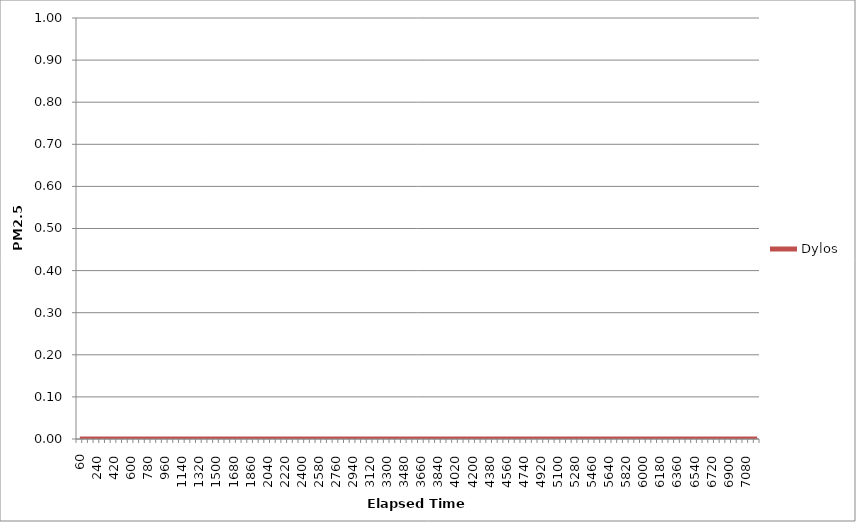
| Category | Dylos |
|---|---|
| 60.0 | 0 |
| 120.0 | 0 |
| 180.0 | 0 |
| 240.0 | 0 |
| 300.0 | 0 |
| 360.0 | 0 |
| 420.0 | 0 |
| 480.0 | 0 |
| 540.0 | 0 |
| 600.0 | 0 |
| 660.0 | 0 |
| 720.0 | 0 |
| 780.0 | 0 |
| 840.0 | 0 |
| 900.0 | 0 |
| 960.0 | 0 |
| 1020.0 | 0 |
| 1080.0 | 0 |
| 1140.0 | 0 |
| 1200.0 | 0 |
| 1260.0 | 0 |
| 1320.0 | 0 |
| 1380.0 | 0 |
| 1440.0 | 0 |
| 1500.0 | 0 |
| 1560.0 | 0 |
| 1620.0 | 0 |
| 1680.0 | 0 |
| 1740.0 | 0 |
| 1800.0 | 0 |
| 1860.0 | 0 |
| 1920.0 | 0 |
| 1980.0 | 0 |
| 2040.0 | 0 |
| 2100.0 | 0 |
| 2160.0 | 0 |
| 2220.0 | 0 |
| 2280.0 | 0 |
| 2340.0 | 0 |
| 2400.0 | 0 |
| 2460.0 | 0 |
| 2520.0 | 0 |
| 2580.0 | 0 |
| 2640.0 | 0 |
| 2700.0 | 0 |
| 2760.0 | 0 |
| 2820.0 | 0 |
| 2880.0 | 0 |
| 2940.0 | 0 |
| 3000.0 | 0 |
| 3060.0 | 0 |
| 3120.0 | 0 |
| 3180.0 | 0 |
| 3240.0 | 0 |
| 3300.0 | 0 |
| 3360.0 | 0 |
| 3420.0 | 0 |
| 3480.0 | 0 |
| 3540.0 | 0 |
| 3600.0 | 0 |
| 3660.0 | 0 |
| 3720.0 | 0 |
| 3780.0 | 0 |
| 3840.0 | 0 |
| 3900.0 | 0 |
| 3960.0 | 0 |
| 4020.0 | 0 |
| 4080.0 | 0 |
| 4140.0 | 0 |
| 4200.0 | 0 |
| 4260.0 | 0 |
| 4320.0 | 0 |
| 4380.0 | 0 |
| 4440.0 | 0 |
| 4500.0 | 0 |
| 4560.0 | 0 |
| 4620.0 | 0 |
| 4680.0 | 0 |
| 4740.0 | 0 |
| 4800.0 | 0 |
| 4860.0 | 0 |
| 4920.0 | 0 |
| 4980.0 | 0 |
| 5040.0 | 0 |
| 5100.0 | 0 |
| 5160.0 | 0 |
| 5220.0 | 0 |
| 5280.0 | 0 |
| 5340.0 | 0 |
| 5400.0 | 0 |
| 5460.0 | 0 |
| 5520.0 | 0 |
| 5580.0 | 0 |
| 5640.0 | 0 |
| 5700.0 | 0 |
| 5760.0 | 0 |
| 5820.0 | 0 |
| 5880.0 | 0 |
| 5940.0 | 0 |
| 6000.0 | 0 |
| 6060.0 | 0 |
| 6120.0 | 0 |
| 6180.0 | 0 |
| 6240.0 | 0 |
| 6300.0 | 0 |
| 6360.0 | 0 |
| 6420.0 | 0 |
| 6480.0 | 0 |
| 6540.0 | 0 |
| 6600.0 | 0 |
| 6660.0 | 0 |
| 6720.0 | 0 |
| 6780.0 | 0 |
| 6840.0 | 0 |
| 6900.0 | 0 |
| 6960.0 | 0 |
| 7020.0 | 0 |
| 7080.0 | 0 |
| 7140.0 | 0 |
| 7200.0 | 0 |